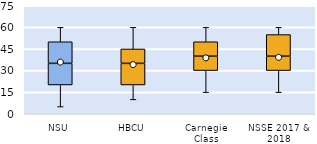
| Category | 25th | 50th | 75th |
|---|---|---|---|
| NSU | 20 | 15 | 15 |
| HBCU | 20 | 15 | 10 |
| Carnegie Class | 30 | 10 | 10 |
| NSSE 2017 & 2018 | 30 | 10 | 15 |